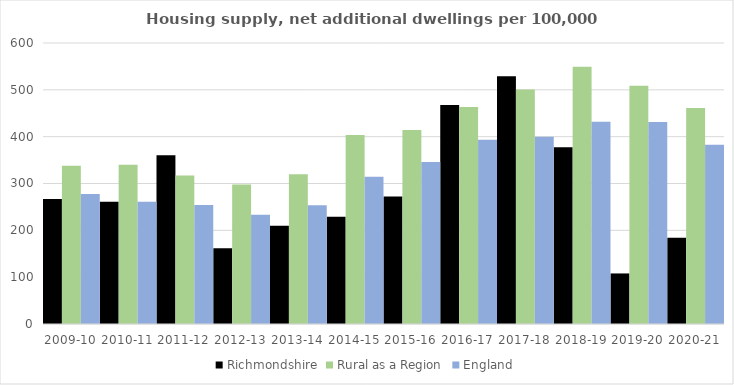
| Category | Richmondshire | Rural as a Region | England |
|---|---|---|---|
| 2009-10 | 267.162 | 337.852 | 277.548 |
| 2010-11 | 261.172 | 340.105 | 260.994 |
| 2011-12 | 360.313 | 317.04 | 254.007 |
| 2012-13 | 161.686 | 297.763 | 233.153 |
| 2013-14 | 209.659 | 319.835 | 253.602 |
| 2014-15 | 229.115 | 403.796 | 314.256 |
| 2015-16 | 272.044 | 414.091 | 346.154 |
| 2016-17 | 467.741 | 463.209 | 393.256 |
| 2017-18 | 528.874 | 500.68 | 399.646 |
| 2018-19 | 377.507 | 549.491 | 432.099 |
| 2019-20 | 107.947 | 508.493 | 431.187 |
| 2020-21 | 184.248 | 461.114 | 382.827 |